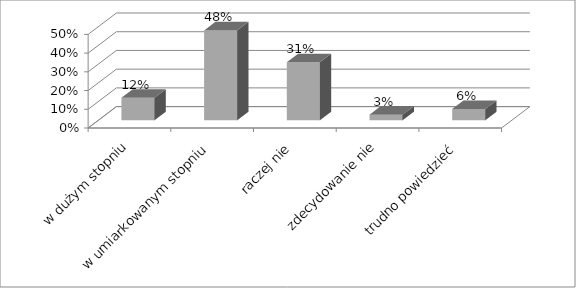
| Category | Series 0 |
|---|---|
| w dużym stopniu | 0.12 |
| w umiarkowanym stopniu | 0.48 |
| raczej nie | 0.31 |
| zdecydowanie nie | 0.03 |
| trudno powiedzieć | 0.06 |